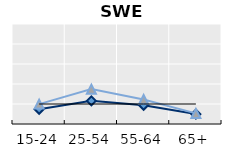
| Category | Public goods | Individual items only | Series 1 |
|---|---|---|---|
| 15-24 | 0.737 | 0.994 | 1 |
| 25-54 | 1.159 | 1.743 | 1 |
| 55-64 | 0.936 | 1.228 | 1 |
| 65+ | 0.496 | 0.53 | 1 |